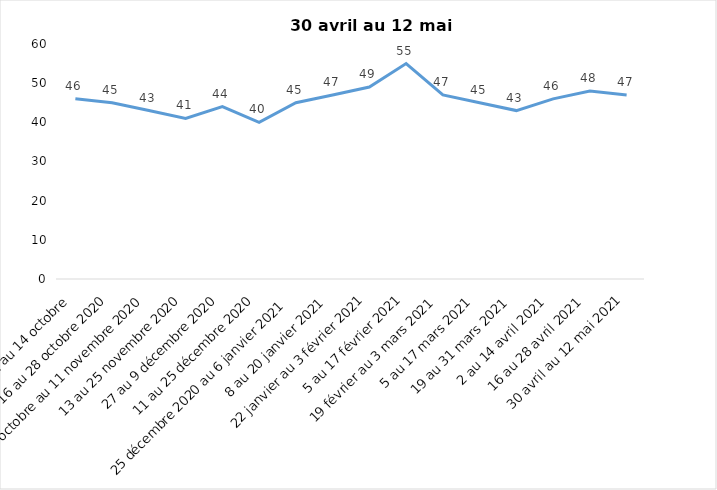
| Category | Toujours aux trois mesures |
|---|---|
| 2 au 14 octobre  | 46 |
| 16 au 28 octobre 2020 | 45 |
| 30 octobre au 11 novembre 2020 | 43 |
| 13 au 25 novembre 2020 | 41 |
| 27 au 9 décembre 2020 | 44 |
| 11 au 25 décembre 2020 | 40 |
| 25 décembre 2020 au 6 janvier 2021 | 45 |
| 8 au 20 janvier 2021 | 47 |
| 22 janvier au 3 février 2021 | 49 |
| 5 au 17 février 2021 | 55 |
| 19 février au 3 mars 2021 | 47 |
| 5 au 17 mars 2021 | 45 |
| 19 au 31 mars 2021 | 43 |
| 2 au 14 avril 2021 | 46 |
| 16 au 28 avril 2021 | 48 |
| 30 avril au 12 mai 2021 | 47 |